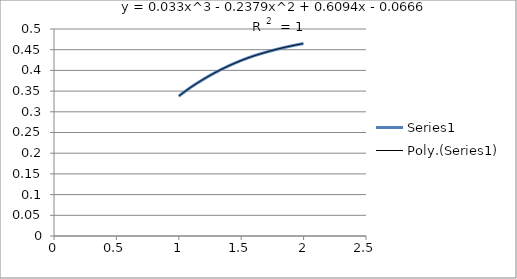
| Category | Series 0 |
|---|---|
| 1.0 | 0.338 |
| 1.1 | 0.36 |
| 1.2 | 0.379 |
| 1.3 | 0.396 |
| 1.4 | 0.411 |
| 1.5 | 0.424 |
| 1.6 | 0.435 |
| 1.7 | 0.444 |
| 1.8 | 0.452 |
| 1.9 | 0.459 |
| 2.0 | 0.465 |